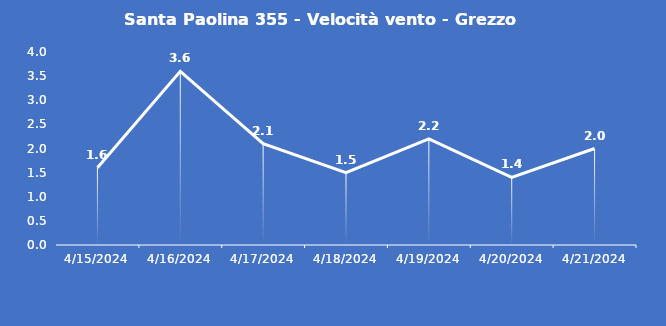
| Category | Santa Paolina 355 - Velocità vento - Grezzo (m/s) |
|---|---|
| 4/15/24 | 1.6 |
| 4/16/24 | 3.6 |
| 4/17/24 | 2.1 |
| 4/18/24 | 1.5 |
| 4/19/24 | 2.2 |
| 4/20/24 | 1.4 |
| 4/21/24 | 2 |